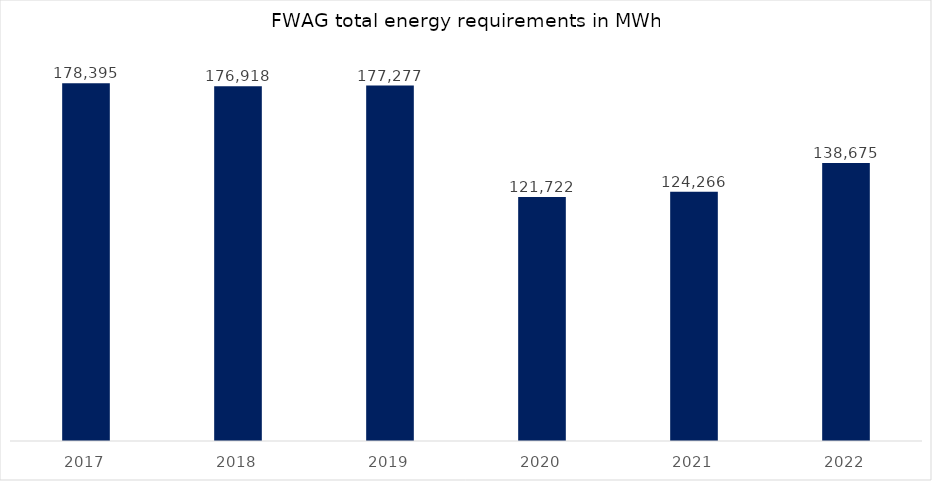
| Category | in MWh |
|---|---|
| 2017.0 | 178394.753 |
| 2018.0 | 176917.781 |
| 2019.0 | 177276.692 |
| 2020.0 | 121722.121 |
| 2021.0 | 124266.023 |
| 2022.0 | 138675.022 |